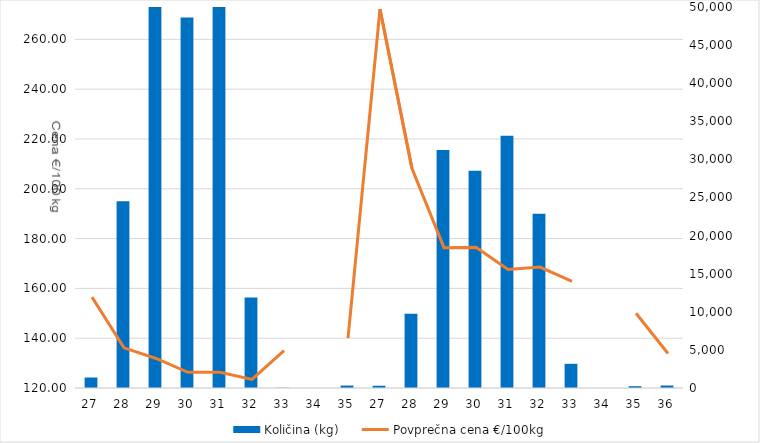
| Category | Količina (kg) |
|---|---|
| 27.0 | 1377 |
| 28.0 | 24496 |
| 29.0 | 62052 |
| 30.0 | 48635 |
| 31.0 | 59270 |
| 32.0 | 11864 |
| 33.0 | 30 |
| 34.0 | 0 |
| 35.0 | 323 |
| 27.0 | 295 |
| 28.0 | 9729 |
| 29.0 | 31242 |
| 30.0 | 28506 |
| 31.0 | 33101 |
| 32.0 | 22869 |
| 33.0 | 3174 |
| 34.0 | 0 |
| 35.0 | 239 |
| 36.0 | 325 |